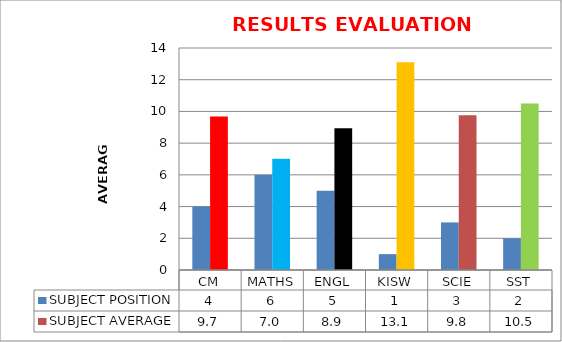
| Category | SUBJECT POSITION | SUBJECT AVERAGE |
|---|---|---|
| CM | 4 | 9.673 |
| MATHS | 6 | 7.014 |
| ENGL | 5 | 8.941 |
| KISW | 1 | 13.107 |
| SCIE | 3 | 9.76 |
| SST | 2 | 10.498 |